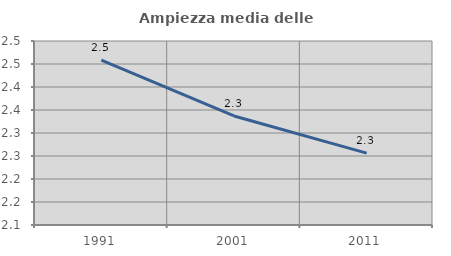
| Category | Ampiezza media delle famiglie |
|---|---|
| 1991.0 | 2.458 |
| 2001.0 | 2.337 |
| 2011.0 | 2.256 |